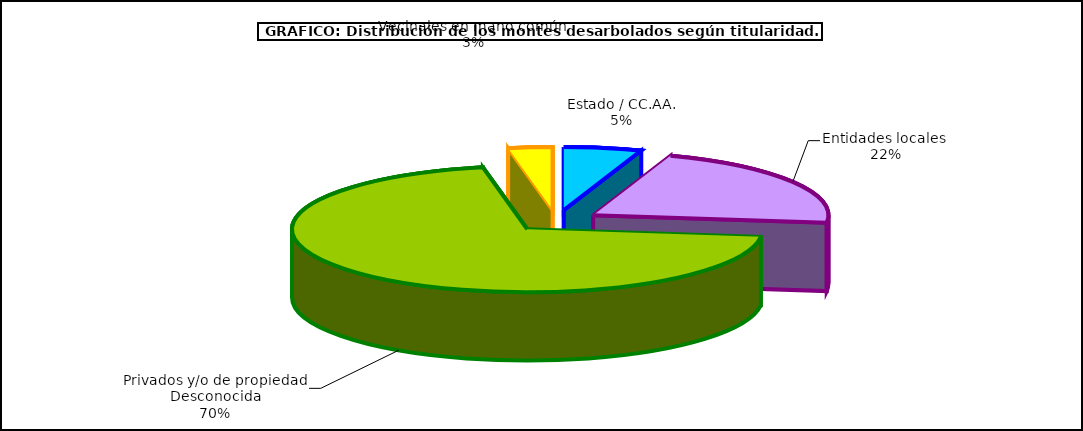
| Category | Series 0 |
|---|---|
| Estado / CC.AA. | 1482055.611 |
| Entidades locales  | 6004428.658 |
| Privados y/o de propiedad Desconocida | 19480841.242 |
| Vecinales en mano común  | 840754.683 |